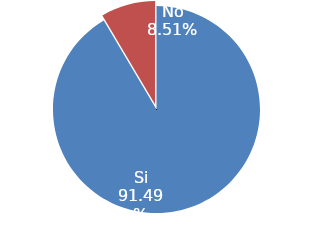
| Category | Series 0 |
|---|---|
| Si | 0.915 |
| No | 0.085 |